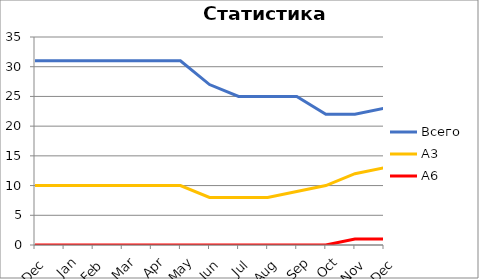
| Category | Всего | А3 | A6 |
|---|---|---|---|
| 0 | 31 | 10 | 0 |
| 1 | 31 | 10 | 0 |
| 2 | 31 | 10 | 0 |
| 3 | 31 | 10 | 0 |
| 4 | 31 | 10 | 0 |
| 5 | 31 | 10 | 0 |
| 6 | 27 | 8 | 0 |
| 7 | 25 | 8 | 0 |
| 8 | 25 | 8 | 0 |
| 9 | 25 | 9 | 0 |
| 10 | 22 | 10 | 0 |
| 11 | 22 | 12 | 1 |
| 12 | 23 | 13 | 1 |